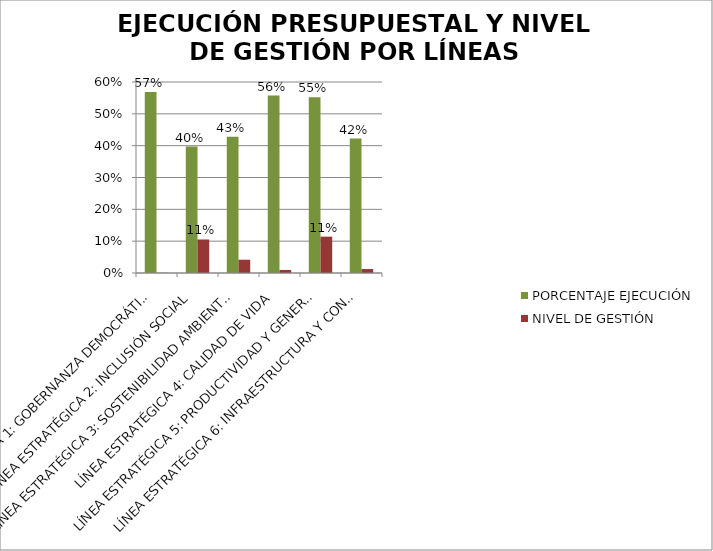
| Category | PORCENTAJE EJECUCIÓN | NIVEL DE GESTIÓN |
|---|---|---|
| LÍNEA ESTRATÉGICA 1: GOBERNANZA DEMOCRÁTICA | 0.568 | 0 |
| LÍNEA ESTRATÉGICA 2: INCLUSIÓN SOCIAL | 0.397 | 0.105 |
| LÍNEA ESTRATÉGICA 3: SOSTENIBILIDAD AMBIENTAL | 0.428 | 0.042 |
| LÍNEA ESTRATÉGICA 4: CALIDAD DE VIDA | 0.557 | 0.01 |
| LÍNEA ESTRATÉGICA 5: PRODUCTIVIDAD Y GENERACIÓN DE OPORTUNIDADES | 0.552 | 0.114 |
| LÍNEA ESTRATÉGICA 6: INFRAESTRUCTURA Y CONECTIVIDAD | 0.422 | 0.012 |